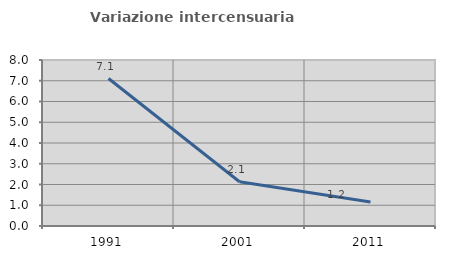
| Category | Variazione intercensuaria annua |
|---|---|
| 1991.0 | 7.108 |
| 2001.0 | 2.135 |
| 2011.0 | 1.16 |